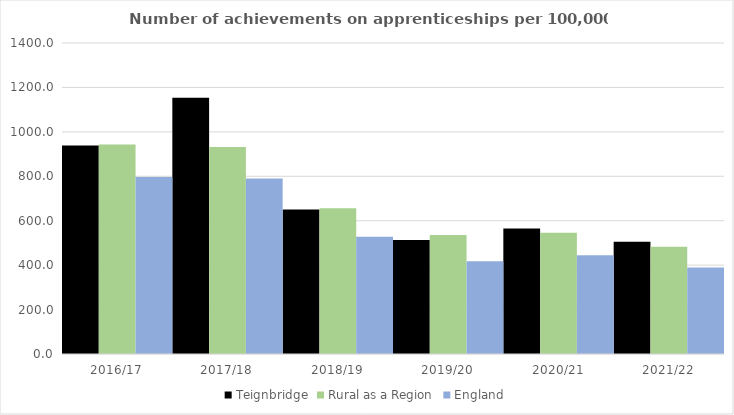
| Category | Teignbridge | Rural as a Region | England |
|---|---|---|---|
| 2016/17 | 939 | 942.594 | 797 |
| 2017/18 | 1153 | 931.709 | 790 |
| 2018/19 | 650 | 656.44 | 528 |
| 2019/20 | 513 | 535.552 | 418 |
| 2020/21 | 565 | 545.333 | 444 |
| 2021/22 | 505 | 482.936 | 389 |